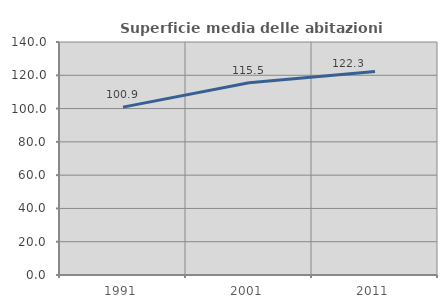
| Category | Superficie media delle abitazioni occupate |
|---|---|
| 1991.0 | 100.86 |
| 2001.0 | 115.473 |
| 2011.0 | 122.259 |